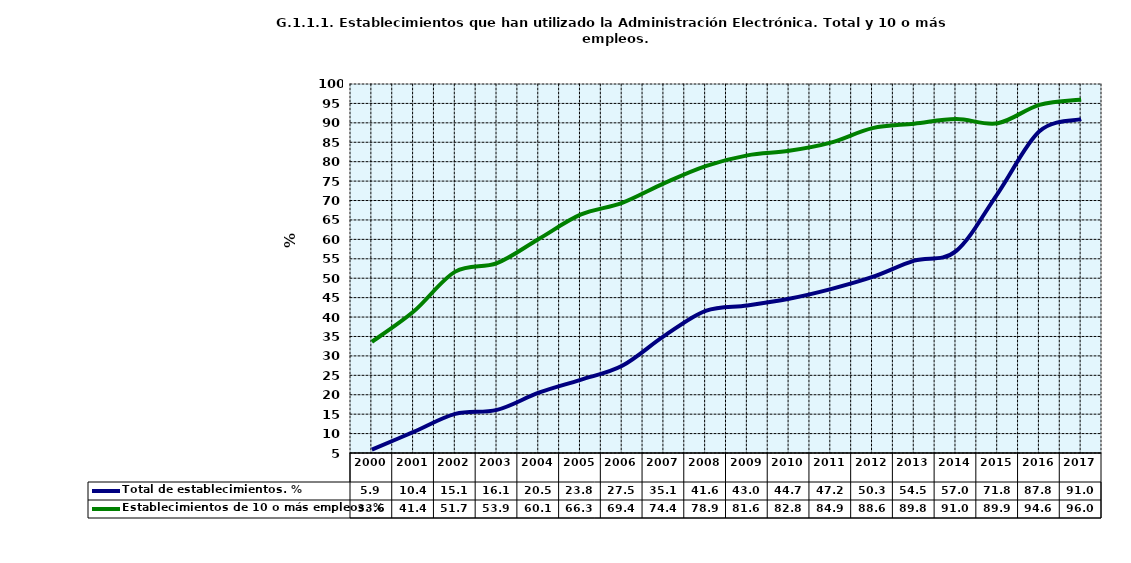
| Category | Total de establecimientos. % | Establecimientos de 10 o más empleos. % |
|---|---|---|
| 2000.0 | 5.883 | 33.627 |
| 2001.0 | 10.421 | 41.411 |
| 2002.0 | 15.068 | 51.694 |
| 2003.0 | 16.098 | 53.904 |
| 2004.0 | 20.515 | 60.107 |
| 2005.0 | 23.837 | 66.349 |
| 2006.0 | 27.46 | 69.402 |
| 2007.0 | 35.078 | 74.42 |
| 2008.0 | 41.612 | 78.862 |
| 2009.0 | 42.972 | 81.627 |
| 2010.0 | 44.715 | 82.794 |
| 2011.0 | 47.2 | 84.9 |
| 2012.0 | 50.321 | 88.639 |
| 2013.0 | 54.524 | 89.774 |
| 2014.0 | 56.986 | 90.972 |
| 2015.0 | 71.8 | 89.9 |
| 2016.0 | 87.813 | 94.63 |
| 2017.0 | 90.959 | 95.981 |